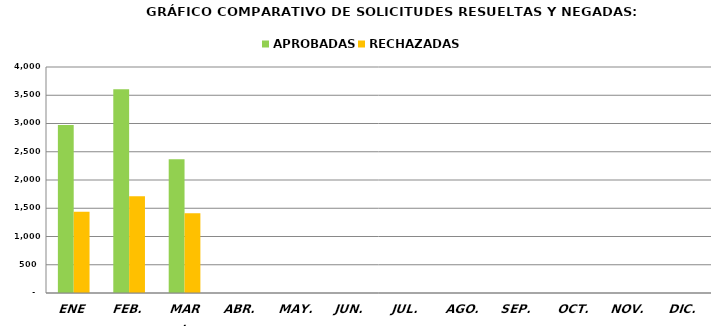
| Category | APROBADAS | RECHAZADAS |
|---|---|---|
| ENE | 2973 | 1436 |
| FEB. | 3608 | 1714 |
| MAR. | 2369 | 1411 |
| ABR. | 0 | 0 |
| MAY. | 0 | 0 |
| JUN. | 0 | 0 |
| JUL. | 0 | 0 |
| AGO. | 0 | 0 |
| SEP. | 0 | 0 |
| OCT. | 0 | 0 |
| NOV. | 0 | 0 |
| DIC. | 0 | 0 |